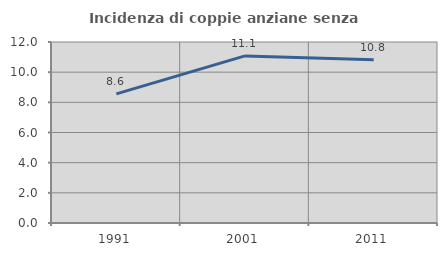
| Category | Incidenza di coppie anziane senza figli  |
|---|---|
| 1991.0 | 8.563 |
| 2001.0 | 11.079 |
| 2011.0 | 10.823 |